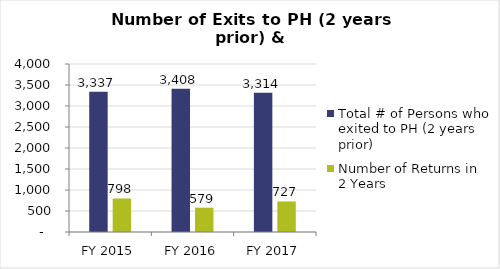
| Category | Total # of Persons who exited to PH (2 years prior) | Number of Returns in 2 Years |
|---|---|---|
| FY 2015 | 3337 | 798 |
| FY 2016 | 3408 | 579 |
| FY 2017 | 3314 | 727 |